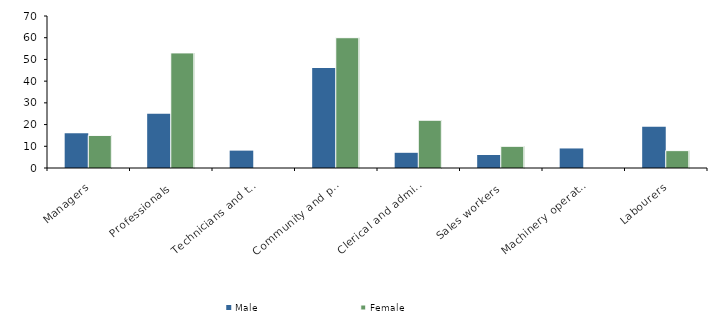
| Category | Male | Female |
|---|---|---|
| Managers | 16 | 15 |
| Professionals | 25 | 53 |
| Technicians and trades workers | 8 | 0 |
| Community and personal service workers | 46 | 60 |
| Clerical and administrative workers | 7 | 22 |
| Sales workers | 6 | 10 |
| Machinery operators and drivers | 9 | 0 |
| Labourers | 19 | 8 |